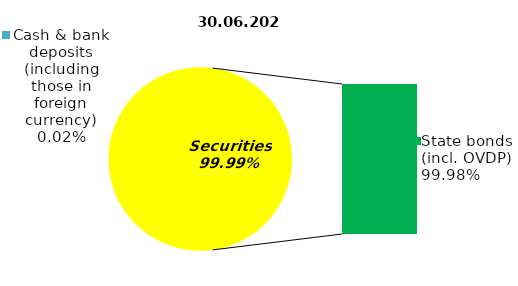
| Category | Series 0 |
|---|---|
| Cash & bank deposits (including those in foreign currency) | 0.034 |
| Bank metals | 0 |
| Real estate | 0 |
| Other assets | 0 |
| Equities | 0 |
| Corporate bonds | 0 |
| Municipal bonds | 0 |
| State bonds (incl. OVDP) | 157.177 |
| Mortgage notes | 0 |